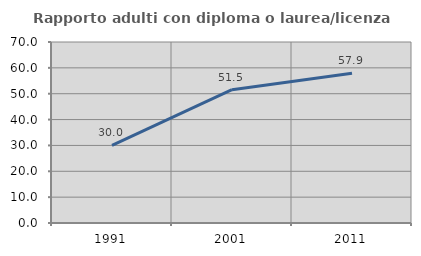
| Category | Rapporto adulti con diploma o laurea/licenza media  |
|---|---|
| 1991.0 | 30 |
| 2001.0 | 51.546 |
| 2011.0 | 57.944 |